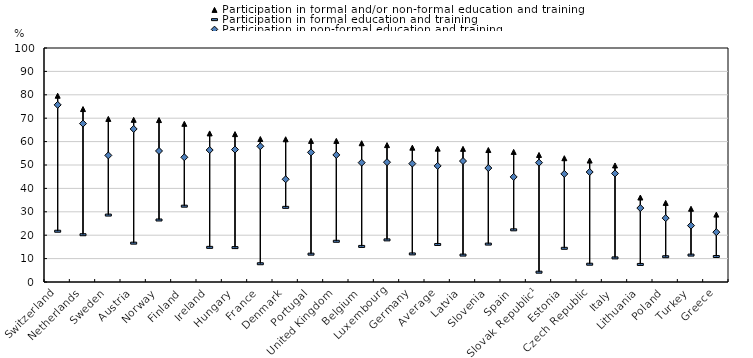
| Category | Participation in formal and/or non-formal education and training | Participation in formal education and training | Participation in non-formal education and training |
|---|---|---|---|
| Switzerland | 79.6 | 21.7 | 75.7 |
| Netherlands | 73.9 | 20.2 | 67.7 |
| Sweden | 69.7 | 28.6 | 54.1 |
| Austria | 69.3 | 16.6 | 65.4 |
| Norway | 69.2 | 26.5 | 56 |
| Finland | 67.6 | 32.4 | 53.3 |
| Ireland | 63.5 | 14.8 | 56.4 |
| Hungary | 63.2 | 14.7 | 56.6 |
| France | 61.1 | 7.8 | 58 |
| Denmark | 61 | 31.9 | 43.9 |
| Portugal | 60.3 | 11.9 | 55.4 |
| United Kingdom | 60.3 | 17.4 | 54.3 |
| Belgium | 59.3 | 15.2 | 51 |
| Luxembourg | 58.5 | 18 | 51.2 |
| Germany | 57.4 | 12 | 50.6 |
| Average | 56.988 | 16.035 | 49.608 |
| Latvia | 56.9 | 11.5 | 51.7 |
| Slovenia | 56.4 | 16.2 | 48.7 |
| Spain | 55.6 | 22.3 | 44.9 |
| Slovak Republic¹ | 54.3 | 4.2 | 51 |
| Estonia | 52.9 | 14.4 | 46.2 |
| Czech Republic | 51.9 | 7.6 | 47 |
| Italy | 49.8 | 10.3 | 46.4 |
| Lithuania | 36.1 | 7.5 | 31.6 |
| Poland | 33.8 | 10.8 | 27.3 |
| Turkey | 31.3 | 11.5 | 24.1 |
| Greece | 28.8 | 10.9 | 21.3 |